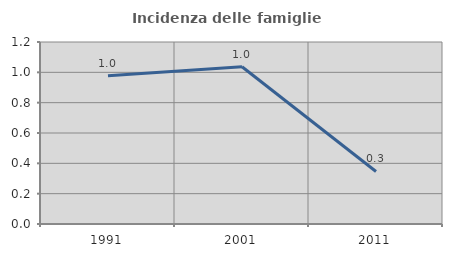
| Category | Incidenza delle famiglie numerose |
|---|---|
| 1991.0 | 0.978 |
| 2001.0 | 1.037 |
| 2011.0 | 0.346 |